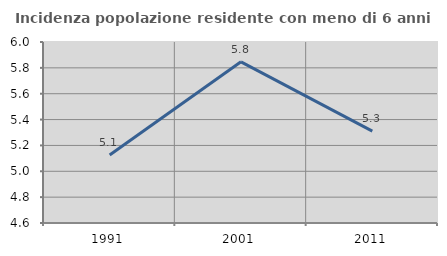
| Category | Incidenza popolazione residente con meno di 6 anni |
|---|---|
| 1991.0 | 5.126 |
| 2001.0 | 5.847 |
| 2011.0 | 5.31 |